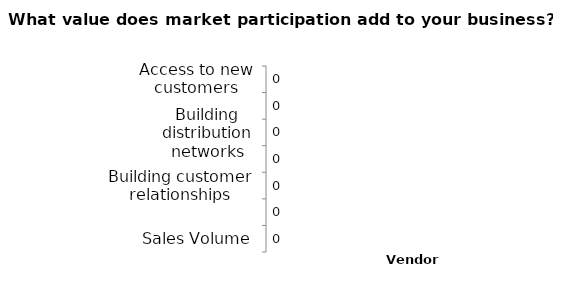
| Category | Series 0 |
|---|---|
| Sales Volume | 0 |
| Branding & Marketing | 0 |
| Building customer relationships | 0 |
| Meeting other vendors | 0 |
| Building distribution networks | 0 |
| Product testing/Market insights | 0 |
| Access to new customers | 0 |